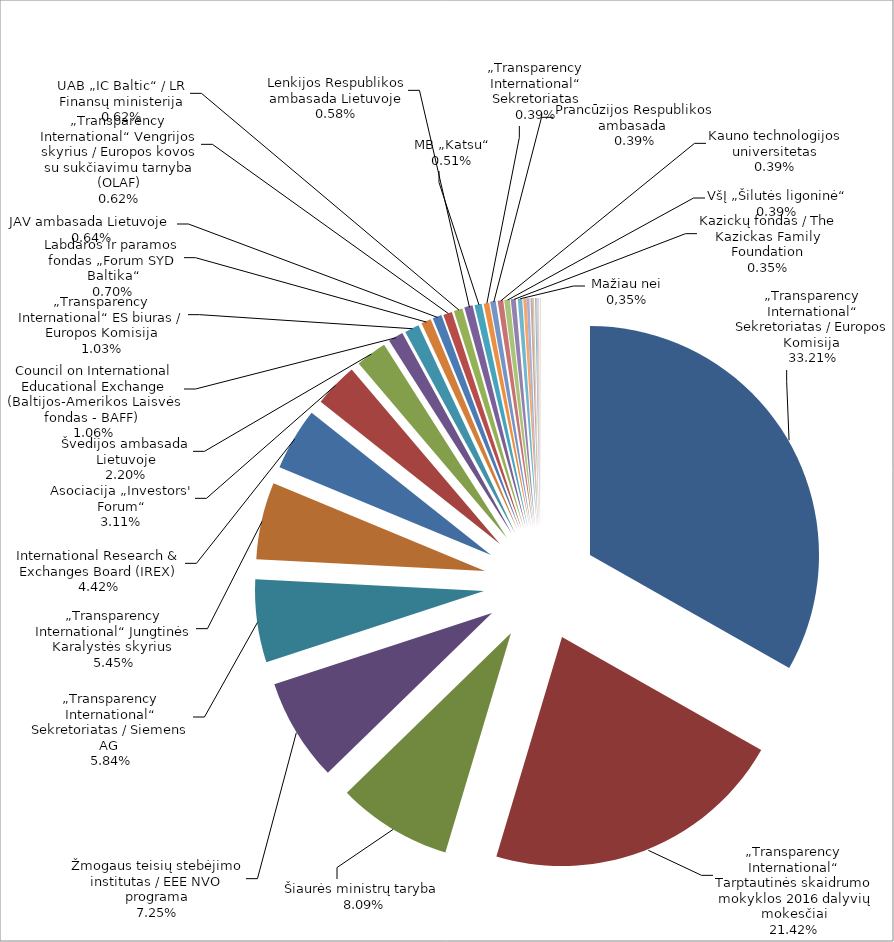
| Category | Series 0 | Series 1 |
|---|---|---|
| „Transparency International“ Sekretoriatas / Europos Komisija  | 85322.6 | 0.332 |
| „Transparency International“ Tarptautinės skaidrumo mokyklos 2016 dalyvių mokesčiai | 55027.97 | 0.214 |
| Šiaurės ministrų taryba  | 20789.27 | 0.081 |
| Žmogaus teisių stebėjimo institutas / EEE NVO programa | 18631.02 | 0.073 |
| „Transparency International“ Sekretoriatas / Siemens AG  | 15000 | 0.058 |
| „Transparency International“ Jungtinės Karalystės skyrius  | 14000 | 0.054 |
| International Research & Exchanges Board (IREX) | 11350.49 | 0.044 |
| Asociacija „Investors' Forum“ | 8000 | 0.031 |
| Švedijos ambasada Lietuvoje | 5641.45 | 0.022 |
| Council on International Educational Exchange (Baltijos-Amerikos Laisvės fondas - BAFF)  | 2727.44 | 0.011 |
| „Transparency International“ ES biuras / Europos Komisija | 2640 | 0.01 |
| Labdaros ir paramos fondas „Forum SYD Baltika“ | 1800 | 0.007 |
| JAV ambasada Lietuvoje  | 1655.95 | 0.006 |
| „Transparency International“ Vengrijos skyrius / Europos kovos su sukčiavimu tarnyba (OLAF) | 1600 | 0.006 |
| UAB „IC Baltic“ / LR Finansų ministerija | 1592.91 | 0.006 |
| Lenkijos Respublikos ambasada Lietuvoje | 1500 | 0.006 |
| MB „Katsu“ | 1300 | 0.005 |
| „Transparency International“ Sekretoriatas | 1000 | 0.004 |
| Prancūzijos Respublikos ambasada  | 1000 | 0.004 |
| Kauno technologijos universitetas | 1000 | 0.004 |
| VšĮ „Šilutės ligoninė“ | 1000 | 0.004 |
| Kazickų fondas / The Kazickas Family Foundation | 893.42 | 0.003 |
| VšĮ „Pilietiškumo, demokratijos ir teisės programų centras“ | 800 | 0.003 |
| TILS skirtas gyventojų pajamų mokestis  | 617.55 | 0.002 |
| IBF International Consulting / Europos Komisija | 500 | 0.002 |
| Tauragės rajono savivaldybės administracija | 400 | 0.002 |
| Kitos TILS uždirbtos lėšos | 242 | 0.001 |
| Aukos (fizinių asmenų) | 234 | 0.001 |
| Vilniaus dizaino kolegija | 200 | 0.001 |
| Policijos departamentas prie Vidaus reikalų ministerijos | 187.5 | 0.001 |
| Vilkaviškio miesto vietos veiklos grupė | 110 | 0 |
| UAB „Vox vera“ | 90 | 0 |
| VšĮ „Geros valios projektai“ | 69.32 | 0 |